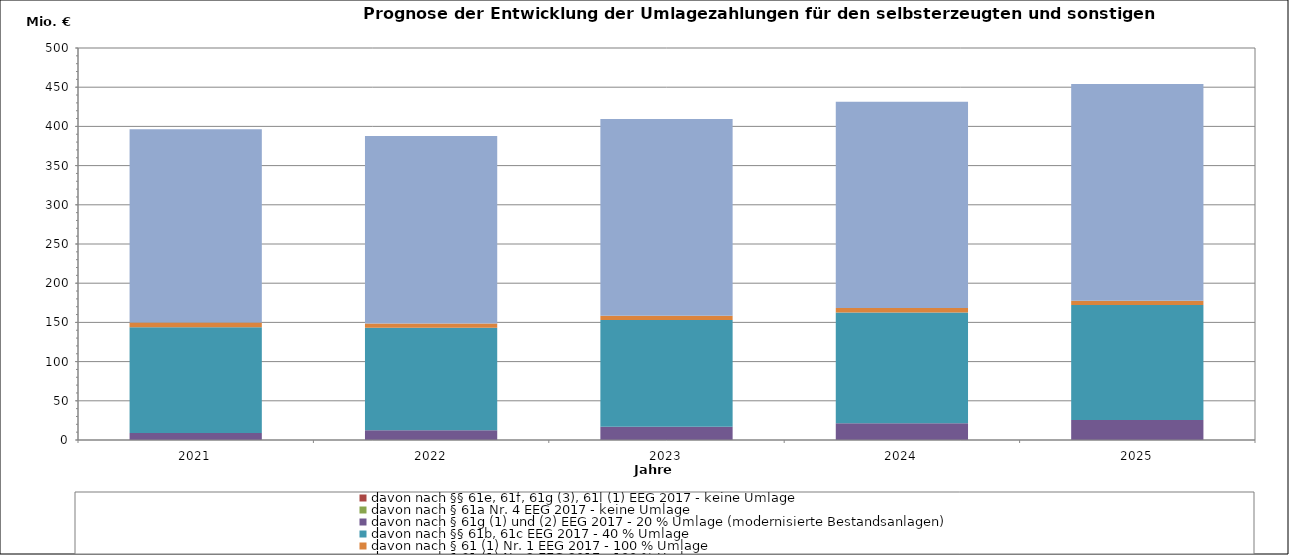
| Category | davon nach §§ 61e, 61f, 61g (3), 61l (1) EEG 2017 - keine Umlage | davon nach § 61a Nr. 4 EEG 2017 - keine Umlage | davon nach § 61g (1) und (2) EEG 2017 - 20 % Umlage (modernisierte Bestandsanlagen) | davon nach §§ 61b, 61c EEG 2017 - 40 % Umlage | entfällt | davon nach § 61 (1) Nr. 1 EEG 2017 - 100 % Umlage | davon nach § 61 (1) Nr. 2 EEG 2017 - 100 % Umlage |
|---|---|---|---|---|---|---|---|
| 2021.0 | 0 | 0 | 8.879 | 135.05 | 0 | 5.906 | 246.473 |
| 2022.0 | 0 | 0 | 12.581 | 130.688 | 0 | 5.452 | 238.889 |
| 2023.0 | 0 | 0 | 16.922 | 136.244 | 0 | 5.452 | 250.833 |
| 2024.0 | 0 | 0 | 21.22 | 141.549 | 0 | 5.452 | 263.375 |
| 2025.0 | 0 | 0 | 25.474 | 146.697 | 0 | 5.452 | 276.544 |